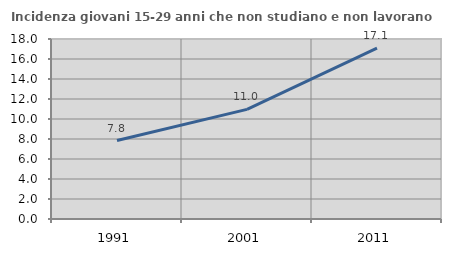
| Category | Incidenza giovani 15-29 anni che non studiano e non lavorano  |
|---|---|
| 1991.0 | 7.843 |
| 2001.0 | 10.959 |
| 2011.0 | 17.085 |